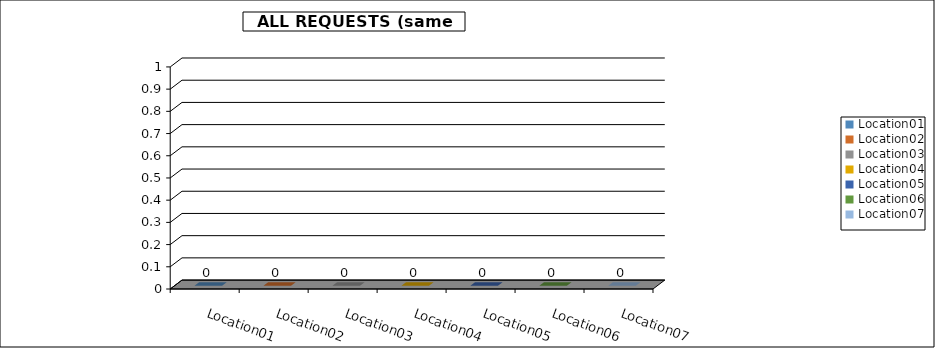
| Category | Series 0 |
|---|---|
| Location01 | 0 |
| Location02 | 0 |
| Location03 | 0 |
| Location04 | 0 |
| Location05 | 0 |
| Location06 | 0 |
| Location07 | 0 |